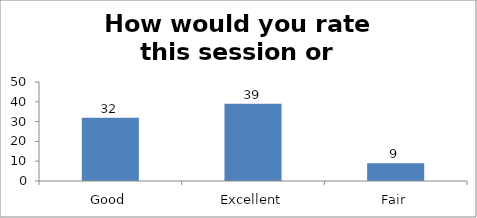
| Category | How would you rate this session or workshop? |
|---|---|
| Good | 32 |
| Excellent | 39 |
| Fair | 9 |